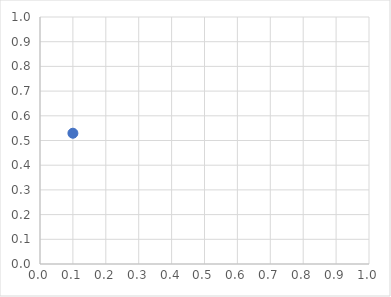
| Category | Series 0 |
|---|---|
| 0.09997490037083001 | 0.529 |